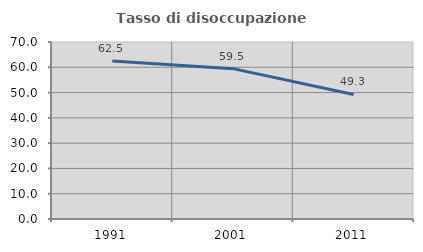
| Category | Tasso di disoccupazione giovanile  |
|---|---|
| 1991.0 | 62.476 |
| 2001.0 | 59.459 |
| 2011.0 | 49.25 |